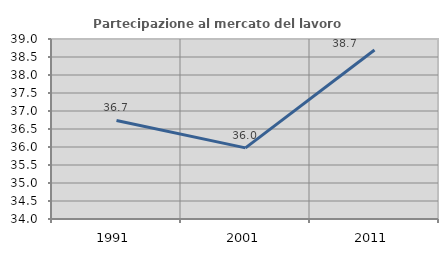
| Category | Partecipazione al mercato del lavoro  femminile |
|---|---|
| 1991.0 | 36.738 |
| 2001.0 | 35.976 |
| 2011.0 | 38.694 |